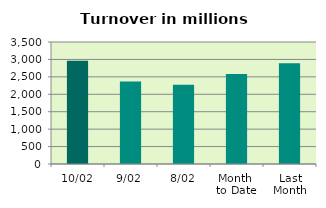
| Category | Series 0 |
|---|---|
| 10/02 | 2961.041 |
| 9/02 | 2363.735 |
| 8/02 | 2270.759 |
| Month 
to Date | 2578.529 |
| Last
Month | 2888.221 |